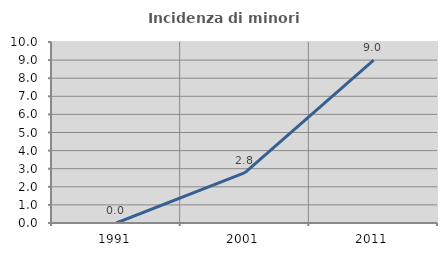
| Category | Incidenza di minori stranieri |
|---|---|
| 1991.0 | 0 |
| 2001.0 | 2.778 |
| 2011.0 | 9 |